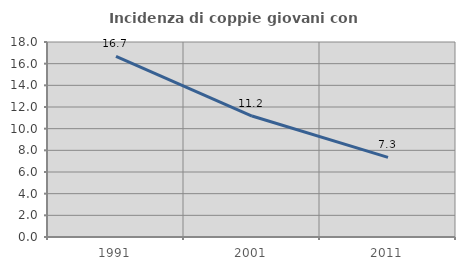
| Category | Incidenza di coppie giovani con figli |
|---|---|
| 1991.0 | 16.663 |
| 2001.0 | 11.166 |
| 2011.0 | 7.35 |